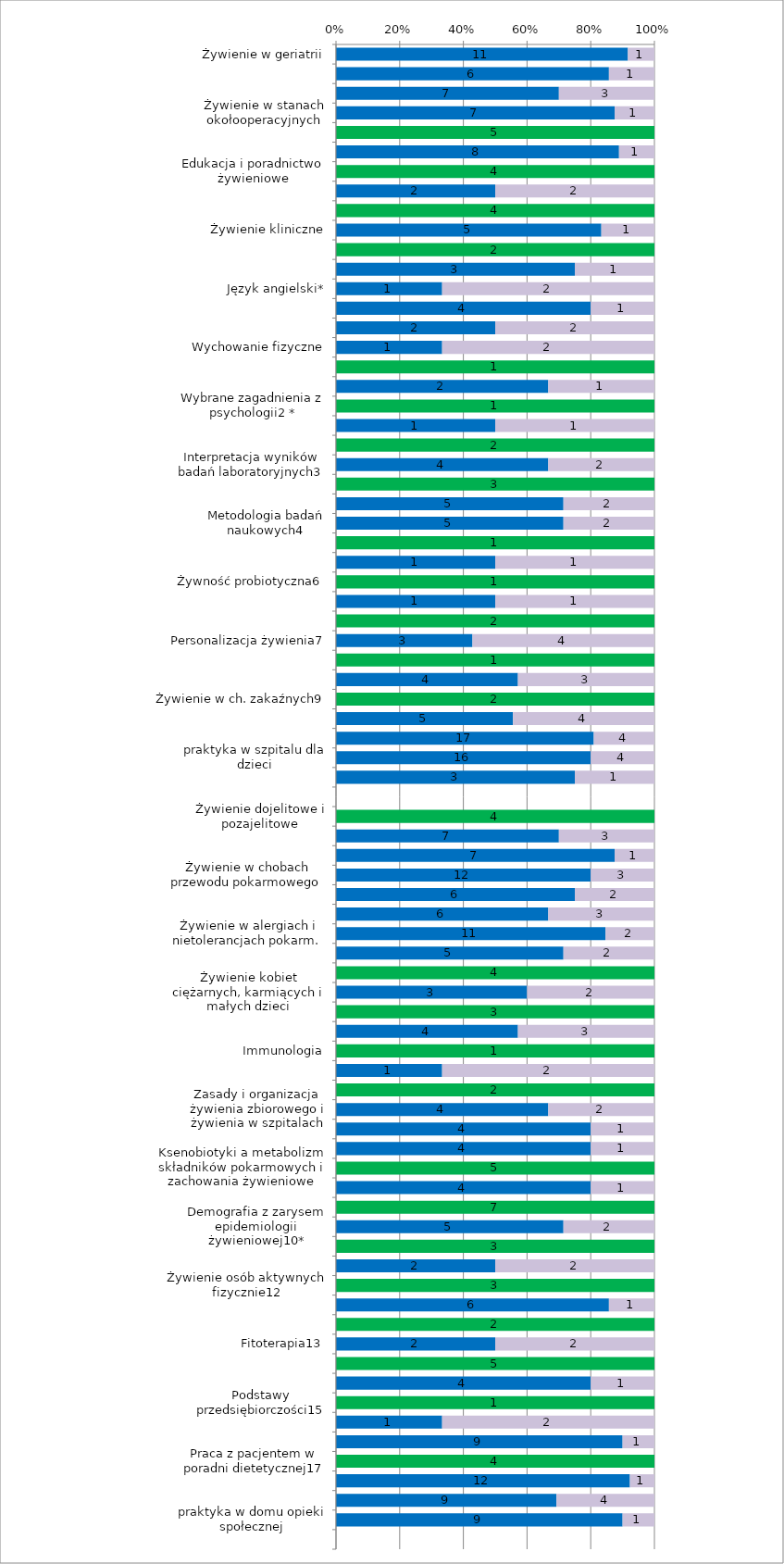
| Category | Series 0 | Series 1 | Series 2 |
|---|---|---|---|
| Żywienie w geriatrii | 0 | 11 | 1 |
| Żywienie w chorobach układu nerwowego | 0 | 6 | 1 |
| Żywienie w ch. Endokrynologicznych | 0 | 7 | 3 |
| Żywienie w stanach okołooperacyjnych | 0 | 7 | 1 |
| Dietoprofilaktyka i leczenie chorób niezakaźnych i żywien.-zależnych | 5 | 0 | 0 |
| Dietoprofilaktyka i leczenie chorób niezakaźnych i żywien.-zależnych | 0 | 8 | 1 |
| Edukacja i poradnictwo żywieniowe | 4 | 0 | 0 |
| Edukacja i poradnictwo żywieniowe | 0 | 2 | 2 |
| Żywienie kliniczne | 4 | 0 | 0 |
| Żywienie kliniczne | 0 | 5 | 1 |
| Fizjologia żywienia człowieka | 2 | 0 | 0 |
| Fizjologia żywienia człowieka | 0 | 3 | 1 |
| Język angielski* | 0 | 1 | 2 |
| Seminarium magisterskie | 0 | 4 | 1 |
| Analiza i interpretacja wyników badań żywieniowych | 0 | 2 | 2 |
| Wychowanie fizyczne | 0 | 1 | 2 |
| Propedeutyka zdrowia publicznego 1 | 1 | 0 | 0 |
| Propedeutyka zdrowia publicznego 1 | 0 | 2 | 1 |
| Wybrane zagadnienia z psychologii2 * | 1 | 0 | 0 |
| Wybrane zagadnienia z psychologii2 * | 0 | 1 | 1 |
| Interpretacja wyników badań laboratoryjnych3 | 2 | 0 | 0 |
| Interpretacja wyników badań laboratoryjnych3 | 0 | 4 | 2 |
| Metodologia badań naukowych4 | 3 | 0 | 0 |
| Metodologia badań naukowych4 | 0 | 5 | 2 |
| Metodologia badań naukowych4 | 0 | 5 | 2 |
| Marketing5  | 1 | 0 | 0 |
| Marketing5  | 0 | 1 | 1 |
| Żywność probiotyczna6 | 1 | 0 | 0 |
| Żywność probiotyczna6 | 0 | 1 | 1 |
| Personalizacja żywienia7 | 2 | 0 | 0 |
| Personalizacja żywienia7 | 0 | 3 | 4 |
| Patofizjologia8 | 1 | 0 | 0 |
| Patofizjologia8 | 0 | 4 | 3 |
| Żywienie w ch. zakaźnych9 | 2 | 0 | 0 |
| Żywienie w ch. zakaźnych9 | 0 | 5 | 4 |
| praktyka w szpitalu dla dorosłych | 0 | 17 | 4 |
| praktyka w szpitalu dla dzieci | 0 | 16 | 4 |
| praktyka w stacji sanitarno-epidemiol. | 0 | 3 | 1 |
| Przedmiot | 0 | 0 | 0 |
| Żywienie dojelitowe i pozajelitowe | 4 | 0 | 0 |
| Żywienie dojelitowe i pozajelitowe | 0 | 7 | 3 |
| Żywienie w chorobach onkologicznych  | 0 | 7 | 1 |
| Żywienie w chobach przewodu pokarmowego  | 0 | 12 | 3 |
| Żywienie w chorobach kości i stawów | 0 | 6 | 2 |
| Żywienie w chorobach nerek | 0 | 6 | 3 |
| Żywienie w alergiach i nietolerancjach pokarm.  | 0 | 11 | 2 |
| Produkcja potraw | 0 | 5 | 2 |
| Żywienie kobiet ciężarnych, karmiących i małych dzieci | 4 | 0 | 0 |
| Żywienie kobiet ciężarnych, karmiących i małych dzieci | 0 | 3 | 2 |
| Jakość i bezpieczeństwo żywności | 3 | 0 | 0 |
| Jakość i bezpieczeństwo żywności | 0 | 4 | 3 |
| Immunologia | 1 | 0 | 0 |
| Immunologia | 0 | 1 | 2 |
| Zasady i organizacja żywienia zbiorowego i żywienia w szpitalach | 2 | 0 | 0 |
| Zasady i organizacja żywienia zbiorowego i żywienia w szpitalach | 0 | 4 | 2 |
| Seminarium magisterskie | 0 | 4 | 1 |
| Seminarium magisterskie | 0 | 4 | 1 |
| Ksenobiotyki a metabolizm składników pokarmowych i zachowania żywieniowe | 5 | 0 | 0 |
| Ksenobiotyki a metabolizm składników pokarmowych i zachowania żywieniowe | 0 | 4 | 1 |
| Demografia z zarysem epidemiologii żywieniowej10* | 7 | 0 | 0 |
| Demografia z zarysem epidemiologii żywieniowej10* | 0 | 5 | 2 |
| Polityka wyżywienia na tle ustawodawstwa żywnościowo-żywieniowego11  | 3 | 0 | 0 |
| Polityka wyżywienia na tle ustawodawstwa żywnościowo-żywieniowego11  | 0 | 2 | 2 |
| Żywienie osób aktywnych fizycznie12 | 3 | 0 | 0 |
| Żywienie osób aktywnych fizycznie12 | 0 | 6 | 1 |
| Fitoterapia13 | 2 | 0 | 0 |
| Fitoterapia13 | 0 | 2 | 2 |
| Kierunki rozwoju technologii żywności14 | 5 | 0 | 0 |
| Kierunki rozwoju technologii żywności14 | 0 | 4 | 1 |
| Podstawy przedsiębiorczości15 | 1 | 0 | 0 |
| Podstawy przedsiębiorczości15 | 0 | 1 | 2 |
| Żywienie w ostrych i przewlekłych powikłaniach miażdżycy16 | 0 | 9 | 1 |
| Praca z pacjentem w poradni dietetycznej17 | 4 | 0 | 0 |
| Praca z pacjentem w poradni dietetycznej17 | 0 | 12 | 1 |
| praktyka w poradni dietetycznej | 0 | 9 | 4 |
| praktyka w domu opieki społecznej | 0 | 9 | 1 |
| Przedmiot | 0 | 0 | 0 |